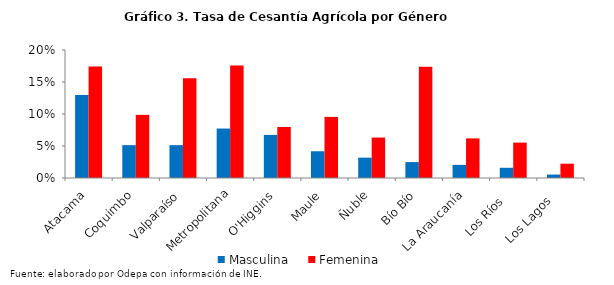
| Category | Masculina | Femenina |
|---|---|---|
| Atacama | 0.13 | 0.174 |
| Coquimbo | 0.051 | 0.099 |
| Valparaíso | 0.051 | 0.156 |
| Metropolitana | 0.077 | 0.176 |
| O'Higgins | 0.067 | 0.08 |
| Maule | 0.042 | 0.095 |
| Ñuble | 0.032 | 0.063 |
| Bío Bío | 0.025 | 0.174 |
| La Araucanía | 0.02 | 0.062 |
| Los Ríos   | 0.016 | 0.055 |
| Los Lagos   | 0.005 | 0.022 |